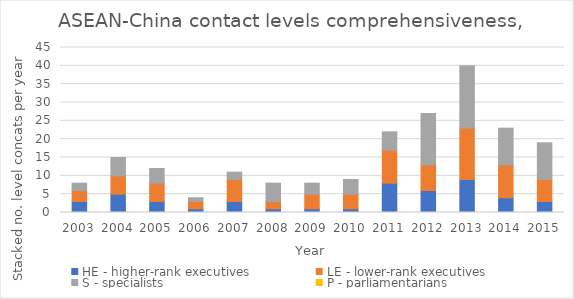
| Category | HE - higher-rank executives | LE - lower-rank executives | S - specialists | P - parliamentarians |
|---|---|---|---|---|
| 2003.0 | 3 | 3 | 2 | 0 |
| 2004.0 | 5 | 5 | 5 | 0 |
| 2005.0 | 3 | 5 | 4 | 0 |
| 2006.0 | 1 | 2 | 1 | 0 |
| 2007.0 | 3 | 6 | 2 | 0 |
| 2008.0 | 1 | 2 | 5 | 0 |
| 2009.0 | 1 | 4 | 3 | 0 |
| 2010.0 | 1 | 4 | 4 | 0 |
| 2011.0 | 8 | 9 | 5 | 0 |
| 2012.0 | 6 | 7 | 14 | 0 |
| 2013.0 | 9 | 14 | 17 | 0 |
| 2014.0 | 4 | 9 | 10 | 0 |
| 2015.0 | 3 | 6 | 10 | 0 |